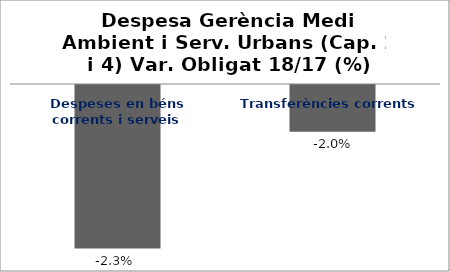
| Category | Series 0 |
|---|---|
| Despeses en béns corrents i serveis | -0.023 |
| Transferències corrents | -0.02 |